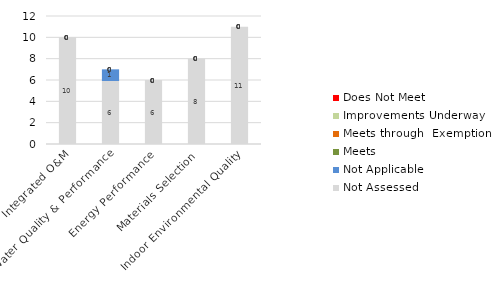
| Category | Not Assessed | Not Applicable | Meets | Meets through  Exemption | Improvements Underway | Does Not Meet |
|---|---|---|---|---|---|---|
| Integrated O&M | 10 | 0 | 0 | 0 | 0 | 0 |
| Water Quality & Performance | 6 | 1 | 0 | 0 | 0 | 0 |
| Energy Performance | 6 | 0 | 0 | 0 | 0 | 0 |
| Materials Selection | 8 | 0 | 0 | 0 | 0 | 0 |
| Indoor Environmental Quality | 11 | 0 | 0 | 0 | 0 | 0 |